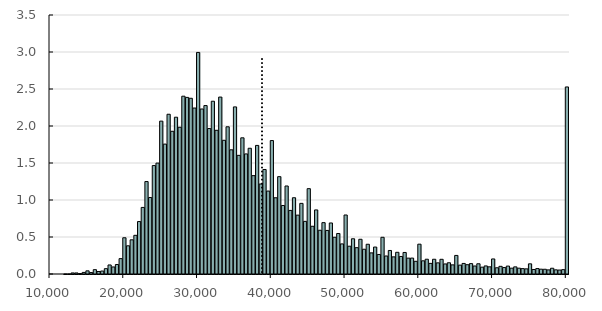
| Category | Andel (%) |
|---|---|
| 10000.0 | 0 |
| 10500.0 | 0 |
| 11000.0 | 0 |
| 11500.0 | 0 |
| 12000.0 | 0.001 |
| 12500.0 | 0 |
| 13000.0 | 0.014 |
| 13500.0 | 0.014 |
| 14000.0 | 0.006 |
| 14500.0 | 0.021 |
| 15000.0 | 0.043 |
| 15500.0 | 0.019 |
| 16000.0 | 0.059 |
| 16500.0 | 0.034 |
| 17000.0 | 0.04 |
| 17500.0 | 0.072 |
| 18000.0 | 0.122 |
| 18500.0 | 0.095 |
| 19000.0 | 0.128 |
| 19500.0 | 0.208 |
| 20000.0 | 0.49 |
| 20500.0 | 0.381 |
| 21000.0 | 0.462 |
| 21500.0 | 0.523 |
| 22000.0 | 0.709 |
| 22500.0 | 0.9 |
| 23000.0 | 1.249 |
| 23500.0 | 1.034 |
| 24000.0 | 1.465 |
| 24500.0 | 1.499 |
| 25000.0 | 2.066 |
| 25500.0 | 1.755 |
| 26000.0 | 2.159 |
| 26500.0 | 1.929 |
| 27000.0 | 2.119 |
| 27500.0 | 1.983 |
| 28000.0 | 2.403 |
| 28500.0 | 2.387 |
| 29000.0 | 2.375 |
| 29500.0 | 2.243 |
| 30000.0 | 2.994 |
| 30500.0 | 2.23 |
| 31000.0 | 2.276 |
| 31500.0 | 1.966 |
| 32000.0 | 2.335 |
| 32500.0 | 1.942 |
| 33000.0 | 2.391 |
| 33500.0 | 1.807 |
| 34000.0 | 1.989 |
| 34500.0 | 1.678 |
| 35000.0 | 2.258 |
| 35500.0 | 1.603 |
| 36000.0 | 1.84 |
| 36500.0 | 1.623 |
| 37000.0 | 1.699 |
| 37500.0 | 1.329 |
| 38000.0 | 1.738 |
| 38500.0 | 1.216 |
| 39000.0 | 1.412 |
| 39500.0 | 1.121 |
| 40000.0 | 1.803 |
| 40500.0 | 1.03 |
| 41000.0 | 1.316 |
| 41500.0 | 0.926 |
| 42000.0 | 1.189 |
| 42500.0 | 0.859 |
| 43000.0 | 1.03 |
| 43500.0 | 0.795 |
| 44000.0 | 0.954 |
| 44500.0 | 0.711 |
| 45000.0 | 1.153 |
| 45500.0 | 0.645 |
| 46000.0 | 0.866 |
| 46500.0 | 0.591 |
| 47000.0 | 0.694 |
| 47500.0 | 0.589 |
| 48000.0 | 0.689 |
| 48500.0 | 0.496 |
| 49000.0 | 0.547 |
| 49500.0 | 0.407 |
| 50000.0 | 0.797 |
| 50500.0 | 0.375 |
| 51000.0 | 0.476 |
| 51500.0 | 0.356 |
| 52000.0 | 0.469 |
| 52500.0 | 0.334 |
| 53000.0 | 0.402 |
| 53500.0 | 0.285 |
| 54000.0 | 0.364 |
| 54500.0 | 0.264 |
| 55000.0 | 0.496 |
| 55500.0 | 0.243 |
| 56000.0 | 0.318 |
| 56500.0 | 0.232 |
| 57000.0 | 0.293 |
| 57500.0 | 0.237 |
| 58000.0 | 0.291 |
| 58500.0 | 0.214 |
| 59000.0 | 0.215 |
| 59500.0 | 0.172 |
| 60000.0 | 0.403 |
| 60500.0 | 0.178 |
| 61000.0 | 0.2 |
| 61500.0 | 0.143 |
| 62000.0 | 0.199 |
| 62500.0 | 0.151 |
| 63000.0 | 0.199 |
| 63500.0 | 0.136 |
| 64000.0 | 0.152 |
| 64500.0 | 0.123 |
| 65000.0 | 0.251 |
| 65500.0 | 0.12 |
| 66000.0 | 0.143 |
| 66500.0 | 0.126 |
| 67000.0 | 0.14 |
| 67500.0 | 0.108 |
| 68000.0 | 0.138 |
| 68500.0 | 0.092 |
| 69000.0 | 0.109 |
| 69500.0 | 0.097 |
| 70000.0 | 0.203 |
| 70500.0 | 0.084 |
| 71000.0 | 0.104 |
| 71500.0 | 0.087 |
| 72000.0 | 0.107 |
| 72500.0 | 0.079 |
| 73000.0 | 0.096 |
| 73500.0 | 0.079 |
| 74000.0 | 0.073 |
| 74500.0 | 0.07 |
| 75000.0 | 0.137 |
| 75500.0 | 0.061 |
| 76000.0 | 0.074 |
| 76500.0 | 0.065 |
| 77000.0 | 0.064 |
| 77500.0 | 0.056 |
| 78000.0 | 0.078 |
| 78500.0 | 0.056 |
| 79000.0 | 0.053 |
| 79500.0 | 0.059 |
| 80000.0 | 2.528 |